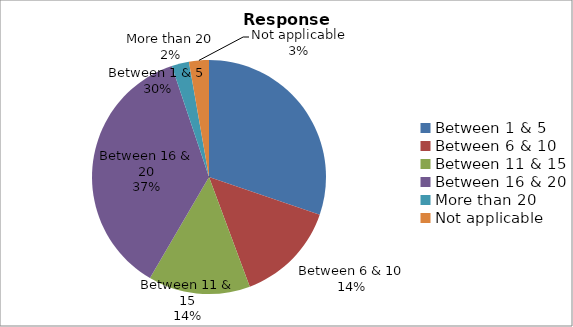
| Category | Series 0 |
|---|---|
| Between 1 & 5 | 88 |
| Between 6 & 10 | 41 |
| Between 11 & 15 | 41 |
| Between 16 & 20 | 106 |
| More than 20 | 7 |
| Not applicable | 8 |